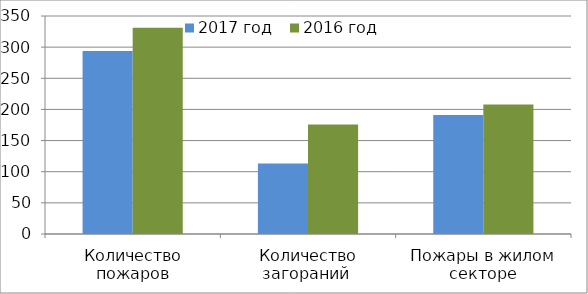
| Category | 2017 год | 2016 год |
|---|---|---|
| Количество пожаров | 294 | 331 |
| Количество загораний  | 113 | 176 |
| Пожары в жилом секторе | 191 | 208 |